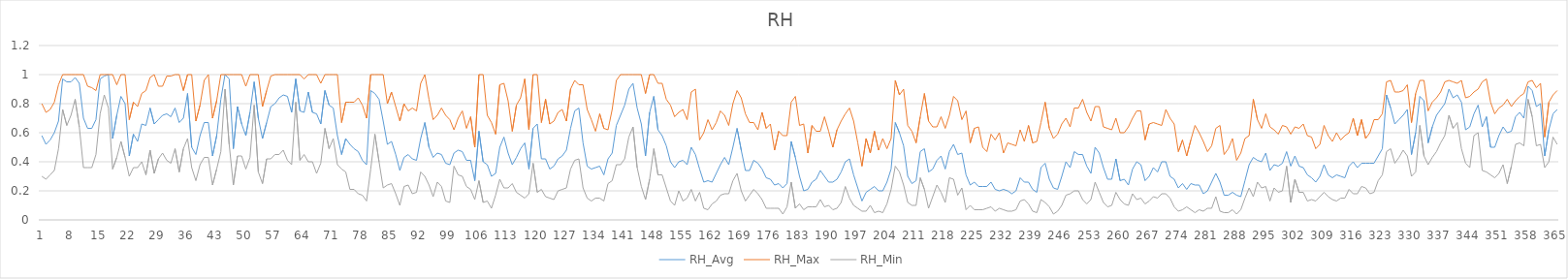
| Category | RH_Avg | RH_Max | RH_Min |
|---|---|---|---|
| 0 | 0.58 | 0.8 | 0.3 |
| 1 | 0.52 | 0.74 | 0.28 |
| 2 | 0.55 | 0.76 | 0.31 |
| 3 | 0.6 | 0.81 | 0.34 |
| 4 | 0.68 | 0.93 | 0.49 |
| 5 | 0.97 | 1 | 0.76 |
| 6 | 0.95 | 1 | 0.65 |
| 7 | 0.95 | 1 | 0.72 |
| 8 | 0.98 | 1 | 0.83 |
| 9 | 0.94 | 1 | 0.64 |
| 10 | 0.7 | 1 | 0.36 |
| 11 | 0.63 | 0.92 | 0.36 |
| 12 | 0.63 | 0.91 | 0.36 |
| 13 | 0.69 | 0.89 | 0.45 |
| 14 | 0.97 | 1 | 0.73 |
| 15 | 0.99 | 1 | 0.86 |
| 16 | 1 | 1 | 0.77 |
| 17 | 0.56 | 1 | 0.35 |
| 18 | 0.72 | 0.93 | 0.43 |
| 19 | 0.85 | 1 | 0.54 |
| 20 | 0.8 | 1 | 0.43 |
| 21 | 0.44 | 0.69 | 0.3 |
| 22 | 0.59 | 0.81 | 0.36 |
| 23 | 0.54 | 0.78 | 0.36 |
| 24 | 0.66 | 0.87 | 0.4 |
| 25 | 0.65 | 0.89 | 0.31 |
| 26 | 0.77 | 0.98 | 0.48 |
| 27 | 0.66 | 1 | 0.32 |
| 28 | 0.69 | 0.92 | 0.42 |
| 29 | 0.72 | 0.92 | 0.46 |
| 30 | 0.73 | 0.99 | 0.41 |
| 31 | 0.71 | 0.99 | 0.39 |
| 32 | 0.77 | 1 | 0.49 |
| 33 | 0.67 | 1 | 0.33 |
| 34 | 0.7 | 0.89 | 0.49 |
| 35 | 0.87 | 1 | 0.56 |
| 36 | 0.5 | 1 | 0.36 |
| 37 | 0.45 | 0.68 | 0.27 |
| 38 | 0.58 | 0.79 | 0.38 |
| 39 | 0.67 | 0.96 | 0.43 |
| 40 | 0.67 | 1 | 0.43 |
| 41 | 0.44 | 0.7 | 0.24 |
| 42 | 0.58 | 0.82 | 0.35 |
| 43 | 0.83 | 1 | 0.47 |
| 44 | 1 | 1 | 0.9 |
| 45 | 0.97 | 1 | 0.52 |
| 46 | 0.49 | 1 | 0.24 |
| 47 | 0.78 | 1 | 0.44 |
| 48 | 0.66 | 1 | 0.44 |
| 49 | 0.58 | 0.92 | 0.35 |
| 50 | 0.74 | 1 | 0.43 |
| 51 | 0.95 | 1 | 0.79 |
| 52 | 0.7 | 1 | 0.33 |
| 53 | 0.56 | 0.78 | 0.25 |
| 54 | 0.67 | 0.89 | 0.42 |
| 55 | 0.78 | 0.99 | 0.42 |
| 56 | 0.8 | 1 | 0.45 |
| 57 | 0.84 | 1 | 0.45 |
| 58 | 0.86 | 1 | 0.48 |
| 59 | 0.85 | 1 | 0.41 |
| 60 | 0.74 | 1 | 0.38 |
| 61 | 0.97 | 1 | 0.81 |
| 62 | 0.75 | 1 | 0.41 |
| 63 | 0.74 | 0.97 | 0.45 |
| 64 | 0.88 | 1 | 0.4 |
| 65 | 0.74 | 1 | 0.4 |
| 66 | 0.73 | 1 | 0.32 |
| 67 | 0.66 | 0.94 | 0.39 |
| 68 | 0.89 | 1 | 0.63 |
| 69 | 0.79 | 1 | 0.49 |
| 70 | 0.77 | 1 | 0.56 |
| 71 | 0.58 | 1 | 0.38 |
| 72 | 0.45 | 0.67 | 0.35 |
| 73 | 0.56 | 0.81 | 0.33 |
| 74 | 0.52 | 0.81 | 0.21 |
| 75 | 0.49 | 0.81 | 0.21 |
| 76 | 0.47 | 0.84 | 0.18 |
| 77 | 0.41 | 0.79 | 0.17 |
| 78 | 0.38 | 0.7 | 0.13 |
| 79 | 0.89 | 1 | 0.35 |
| 80 | 0.87 | 1 | 0.59 |
| 81 | 0.83 | 1 | 0.4 |
| 82 | 0.68 | 1 | 0.22 |
| 83 | 0.52 | 0.8 | 0.24 |
| 84 | 0.54 | 0.88 | 0.25 |
| 85 | 0.45 | 0.78 | 0.18 |
| 86 | 0.34 | 0.68 | 0.1 |
| 87 | 0.43 | 0.8 | 0.23 |
| 88 | 0.45 | 0.75 | 0.24 |
| 89 | 0.42 | 0.77 | 0.18 |
| 90 | 0.41 | 0.75 | 0.19 |
| 91 | 0.56 | 0.94 | 0.33 |
| 92 | 0.67 | 1 | 0.3 |
| 93 | 0.5 | 0.83 | 0.24 |
| 94 | 0.43 | 0.69 | 0.16 |
| 95 | 0.46 | 0.72 | 0.26 |
| 96 | 0.45 | 0.77 | 0.23 |
| 97 | 0.39 | 0.72 | 0.13 |
| 98 | 0.38 | 0.69 | 0.12 |
| 99 | 0.46 | 0.62 | 0.37 |
| 100 | 0.48 | 0.7 | 0.31 |
| 101 | 0.47 | 0.75 | 0.3 |
| 102 | 0.41 | 0.63 | 0.23 |
| 103 | 0.41 | 0.71 | 0.21 |
| 104 | 0.27 | 0.5 | 0.14 |
| 105 | 0.61 | 1 | 0.27 |
| 106 | 0.4 | 1 | 0.12 |
| 107 | 0.38 | 0.72 | 0.13 |
| 108 | 0.3 | 0.67 | 0.08 |
| 109 | 0.32 | 0.59 | 0.17 |
| 110 | 0.5 | 0.93 | 0.28 |
| 111 | 0.57 | 0.94 | 0.22 |
| 112 | 0.46 | 0.82 | 0.22 |
| 113 | 0.38 | 0.61 | 0.25 |
| 114 | 0.43 | 0.79 | 0.19 |
| 115 | 0.49 | 0.84 | 0.17 |
| 116 | 0.53 | 0.97 | 0.15 |
| 117 | 0.35 | 0.62 | 0.18 |
| 118 | 0.63 | 1 | 0.39 |
| 119 | 0.66 | 1 | 0.19 |
| 120 | 0.42 | 0.67 | 0.21 |
| 121 | 0.42 | 0.83 | 0.16 |
| 122 | 0.35 | 0.66 | 0.15 |
| 123 | 0.37 | 0.68 | 0.14 |
| 124 | 0.42 | 0.74 | 0.2 |
| 125 | 0.44 | 0.76 | 0.21 |
| 126 | 0.48 | 0.68 | 0.22 |
| 127 | 0.63 | 0.9 | 0.35 |
| 128 | 0.75 | 0.96 | 0.41 |
| 129 | 0.77 | 0.93 | 0.42 |
| 130 | 0.53 | 0.93 | 0.22 |
| 131 | 0.37 | 0.76 | 0.15 |
| 132 | 0.35 | 0.69 | 0.13 |
| 133 | 0.36 | 0.61 | 0.15 |
| 134 | 0.37 | 0.73 | 0.15 |
| 135 | 0.31 | 0.63 | 0.13 |
| 136 | 0.42 | 0.62 | 0.25 |
| 137 | 0.46 | 0.76 | 0.27 |
| 138 | 0.65 | 0.96 | 0.38 |
| 139 | 0.72 | 1 | 0.38 |
| 140 | 0.79 | 1 | 0.42 |
| 141 | 0.9 | 1 | 0.57 |
| 142 | 0.94 | 1 | 0.64 |
| 143 | 0.77 | 1 | 0.36 |
| 144 | 0.66 | 1 | 0.23 |
| 145 | 0.44 | 0.87 | 0.14 |
| 146 | 0.74 | 1 | 0.28 |
| 147 | 0.85 | 1 | 0.49 |
| 148 | 0.62 | 0.94 | 0.31 |
| 149 | 0.58 | 0.94 | 0.31 |
| 150 | 0.51 | 0.83 | 0.22 |
| 151 | 0.4 | 0.79 | 0.13 |
| 152 | 0.36 | 0.71 | 0.1 |
| 153 | 0.4 | 0.74 | 0.2 |
| 154 | 0.41 | 0.76 | 0.13 |
| 155 | 0.38 | 0.69 | 0.15 |
| 156 | 0.5 | 0.88 | 0.21 |
| 157 | 0.45 | 0.9 | 0.13 |
| 158 | 0.35 | 0.55 | 0.19 |
| 159 | 0.26 | 0.6 | 0.08 |
| 160 | 0.27 | 0.69 | 0.07 |
| 161 | 0.26 | 0.62 | 0.11 |
| 162 | 0.32 | 0.67 | 0.13 |
| 163 | 0.38 | 0.75 | 0.17 |
| 164 | 0.43 | 0.72 | 0.18 |
| 165 | 0.38 | 0.65 | 0.18 |
| 166 | 0.5 | 0.8 | 0.27 |
| 167 | 0.63 | 0.89 | 0.32 |
| 168 | 0.48 | 0.84 | 0.2 |
| 169 | 0.34 | 0.73 | 0.13 |
| 170 | 0.34 | 0.67 | 0.17 |
| 171 | 0.41 | 0.67 | 0.21 |
| 172 | 0.39 | 0.62 | 0.18 |
| 173 | 0.35 | 0.74 | 0.14 |
| 174 | 0.29 | 0.63 | 0.08 |
| 175 | 0.28 | 0.66 | 0.08 |
| 176 | 0.24 | 0.48 | 0.08 |
| 177 | 0.25 | 0.61 | 0.08 |
| 178 | 0.22 | 0.58 | 0.04 |
| 179 | 0.25 | 0.58 | 0.09 |
| 180 | 0.54 | 0.81 | 0.26 |
| 181 | 0.43 | 0.85 | 0.08 |
| 182 | 0.3 | 0.65 | 0.11 |
| 183 | 0.2 | 0.66 | 0.07 |
| 184 | 0.21 | 0.46 | 0.09 |
| 185 | 0.26 | 0.65 | 0.09 |
| 186 | 0.28 | 0.61 | 0.09 |
| 187 | 0.34 | 0.61 | 0.14 |
| 188 | 0.3 | 0.71 | 0.09 |
| 189 | 0.26 | 0.61 | 0.1 |
| 190 | 0.26 | 0.5 | 0.07 |
| 191 | 0.28 | 0.62 | 0.08 |
| 192 | 0.33 | 0.68 | 0.12 |
| 193 | 0.4 | 0.73 | 0.23 |
| 194 | 0.42 | 0.77 | 0.15 |
| 195 | 0.31 | 0.68 | 0.1 |
| 196 | 0.22 | 0.53 | 0.08 |
| 197 | 0.13 | 0.37 | 0.06 |
| 198 | 0.19 | 0.56 | 0.06 |
| 199 | 0.21 | 0.46 | 0.1 |
| 200 | 0.23 | 0.61 | 0.05 |
| 201 | 0.2 | 0.48 | 0.06 |
| 202 | 0.2 | 0.56 | 0.05 |
| 203 | 0.26 | 0.49 | 0.11 |
| 204 | 0.35 | 0.56 | 0.21 |
| 205 | 0.67 | 0.96 | 0.37 |
| 206 | 0.6 | 0.86 | 0.33 |
| 207 | 0.51 | 0.9 | 0.24 |
| 208 | 0.3 | 0.65 | 0.12 |
| 209 | 0.25 | 0.61 | 0.1 |
| 210 | 0.27 | 0.53 | 0.1 |
| 211 | 0.47 | 0.71 | 0.29 |
| 212 | 0.49 | 0.87 | 0.21 |
| 213 | 0.33 | 0.68 | 0.08 |
| 214 | 0.35 | 0.64 | 0.16 |
| 215 | 0.41 | 0.64 | 0.24 |
| 216 | 0.44 | 0.71 | 0.19 |
| 217 | 0.35 | 0.63 | 0.12 |
| 218 | 0.47 | 0.72 | 0.29 |
| 219 | 0.52 | 0.85 | 0.28 |
| 220 | 0.45 | 0.82 | 0.17 |
| 221 | 0.46 | 0.69 | 0.22 |
| 222 | 0.31 | 0.75 | 0.07 |
| 223 | 0.24 | 0.53 | 0.1 |
| 224 | 0.26 | 0.63 | 0.07 |
| 225 | 0.23 | 0.64 | 0.07 |
| 226 | 0.23 | 0.5 | 0.07 |
| 227 | 0.23 | 0.47 | 0.08 |
| 228 | 0.26 | 0.59 | 0.09 |
| 229 | 0.21 | 0.55 | 0.06 |
| 230 | 0.2 | 0.6 | 0.08 |
| 231 | 0.21 | 0.46 | 0.07 |
| 232 | 0.2 | 0.53 | 0.06 |
| 233 | 0.18 | 0.52 | 0.06 |
| 234 | 0.2 | 0.51 | 0.07 |
| 235 | 0.29 | 0.62 | 0.13 |
| 236 | 0.26 | 0.54 | 0.14 |
| 237 | 0.26 | 0.65 | 0.11 |
| 238 | 0.21 | 0.53 | 0.06 |
| 239 | 0.19 | 0.54 | 0.05 |
| 240 | 0.36 | 0.67 | 0.14 |
| 241 | 0.39 | 0.81 | 0.12 |
| 242 | 0.28 | 0.63 | 0.09 |
| 243 | 0.22 | 0.56 | 0.04 |
| 244 | 0.21 | 0.59 | 0.06 |
| 245 | 0.3 | 0.66 | 0.1 |
| 246 | 0.4 | 0.7 | 0.17 |
| 247 | 0.36 | 0.64 | 0.18 |
| 248 | 0.47 | 0.77 | 0.2 |
| 249 | 0.45 | 0.77 | 0.2 |
| 250 | 0.45 | 0.83 | 0.14 |
| 251 | 0.37 | 0.74 | 0.11 |
| 252 | 0.32 | 0.68 | 0.14 |
| 253 | 0.5 | 0.78 | 0.26 |
| 254 | 0.46 | 0.78 | 0.19 |
| 255 | 0.36 | 0.64 | 0.12 |
| 256 | 0.28 | 0.63 | 0.09 |
| 257 | 0.28 | 0.62 | 0.1 |
| 258 | 0.42 | 0.7 | 0.19 |
| 259 | 0.27 | 0.6 | 0.14 |
| 260 | 0.28 | 0.6 | 0.11 |
| 261 | 0.24 | 0.64 | 0.1 |
| 262 | 0.35 | 0.7 | 0.18 |
| 263 | 0.4 | 0.75 | 0.14 |
| 264 | 0.38 | 0.75 | 0.15 |
| 265 | 0.27 | 0.55 | 0.11 |
| 266 | 0.3 | 0.66 | 0.13 |
| 267 | 0.36 | 0.67 | 0.16 |
| 268 | 0.33 | 0.66 | 0.15 |
| 269 | 0.4 | 0.65 | 0.18 |
| 270 | 0.4 | 0.76 | 0.18 |
| 271 | 0.3 | 0.7 | 0.15 |
| 272 | 0.28 | 0.66 | 0.09 |
| 273 | 0.22 | 0.47 | 0.06 |
| 274 | 0.25 | 0.55 | 0.07 |
| 275 | 0.21 | 0.44 | 0.09 |
| 276 | 0.25 | 0.55 | 0.07 |
| 277 | 0.24 | 0.65 | 0.05 |
| 278 | 0.24 | 0.6 | 0.07 |
| 279 | 0.18 | 0.54 | 0.06 |
| 280 | 0.2 | 0.47 | 0.08 |
| 281 | 0.26 | 0.51 | 0.08 |
| 282 | 0.32 | 0.63 | 0.16 |
| 283 | 0.26 | 0.65 | 0.06 |
| 284 | 0.17 | 0.45 | 0.05 |
| 285 | 0.17 | 0.49 | 0.05 |
| 286 | 0.19 | 0.56 | 0.07 |
| 287 | 0.17 | 0.41 | 0.04 |
| 288 | 0.16 | 0.46 | 0.07 |
| 289 | 0.27 | 0.56 | 0.15 |
| 290 | 0.38 | 0.58 | 0.22 |
| 291 | 0.43 | 0.83 | 0.16 |
| 292 | 0.41 | 0.69 | 0.26 |
| 293 | 0.4 | 0.63 | 0.22 |
| 294 | 0.46 | 0.73 | 0.23 |
| 295 | 0.34 | 0.64 | 0.13 |
| 296 | 0.38 | 0.62 | 0.22 |
| 297 | 0.37 | 0.59 | 0.19 |
| 298 | 0.39 | 0.65 | 0.2 |
| 299 | 0.47 | 0.64 | 0.37 |
| 300 | 0.37 | 0.59 | 0.12 |
| 301 | 0.44 | 0.64 | 0.28 |
| 302 | 0.37 | 0.63 | 0.19 |
| 303 | 0.36 | 0.66 | 0.19 |
| 304 | 0.31 | 0.58 | 0.13 |
| 305 | 0.29 | 0.57 | 0.14 |
| 306 | 0.26 | 0.49 | 0.13 |
| 307 | 0.3 | 0.52 | 0.16 |
| 308 | 0.38 | 0.65 | 0.19 |
| 309 | 0.31 | 0.58 | 0.16 |
| 310 | 0.29 | 0.54 | 0.14 |
| 311 | 0.31 | 0.6 | 0.13 |
| 312 | 0.3 | 0.55 | 0.15 |
| 313 | 0.29 | 0.58 | 0.15 |
| 314 | 0.37 | 0.6 | 0.21 |
| 315 | 0.4 | 0.7 | 0.18 |
| 316 | 0.36 | 0.58 | 0.18 |
| 317 | 0.39 | 0.69 | 0.23 |
| 318 | 0.39 | 0.56 | 0.22 |
| 319 | 0.39 | 0.6 | 0.18 |
| 320 | 0.39 | 0.69 | 0.19 |
| 321 | 0.44 | 0.69 | 0.27 |
| 322 | 0.49 | 0.73 | 0.31 |
| 323 | 0.86 | 0.95 | 0.47 |
| 324 | 0.77 | 0.96 | 0.49 |
| 325 | 0.66 | 0.88 | 0.39 |
| 326 | 0.69 | 0.88 | 0.43 |
| 327 | 0.72 | 0.89 | 0.48 |
| 328 | 0.76 | 0.93 | 0.44 |
| 329 | 0.45 | 0.67 | 0.3 |
| 330 | 0.6 | 0.87 | 0.33 |
| 331 | 0.85 | 0.96 | 0.65 |
| 332 | 0.82 | 0.96 | 0.44 |
| 333 | 0.53 | 0.75 | 0.38 |
| 334 | 0.64 | 0.81 | 0.43 |
| 335 | 0.72 | 0.84 | 0.47 |
| 336 | 0.76 | 0.88 | 0.53 |
| 337 | 0.8 | 0.95 | 0.58 |
| 338 | 0.9 | 0.96 | 0.72 |
| 339 | 0.84 | 0.95 | 0.63 |
| 340 | 0.86 | 0.94 | 0.67 |
| 341 | 0.81 | 0.96 | 0.49 |
| 342 | 0.62 | 0.84 | 0.39 |
| 343 | 0.64 | 0.85 | 0.36 |
| 344 | 0.73 | 0.88 | 0.58 |
| 345 | 0.79 | 0.9 | 0.6 |
| 346 | 0.64 | 0.95 | 0.34 |
| 347 | 0.71 | 0.97 | 0.33 |
| 348 | 0.5 | 0.81 | 0.31 |
| 349 | 0.5 | 0.73 | 0.29 |
| 350 | 0.58 | 0.77 | 0.32 |
| 351 | 0.64 | 0.79 | 0.38 |
| 352 | 0.6 | 0.83 | 0.25 |
| 353 | 0.61 | 0.78 | 0.37 |
| 354 | 0.71 | 0.82 | 0.52 |
| 355 | 0.74 | 0.85 | 0.53 |
| 356 | 0.7 | 0.87 | 0.51 |
| 357 | 0.92 | 0.95 | 0.83 |
| 358 | 0.89 | 0.96 | 0.71 |
| 359 | 0.78 | 0.91 | 0.51 |
| 360 | 0.8 | 0.94 | 0.52 |
| 361 | 0.44 | 0.57 | 0.36 |
| 362 | 0.62 | 0.81 | 0.4 |
| 363 | 0.73 | 0.86 | 0.57 |
| 364 | 0.76 | 0.89 | 0.52 |